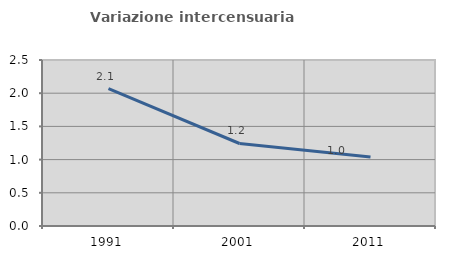
| Category | Variazione intercensuaria annua |
|---|---|
| 1991.0 | 2.071 |
| 2001.0 | 1.243 |
| 2011.0 | 1.038 |